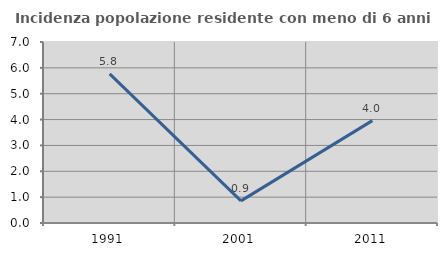
| Category | Incidenza popolazione residente con meno di 6 anni |
|---|---|
| 1991.0 | 5.769 |
| 2001.0 | 0.855 |
| 2011.0 | 3.96 |